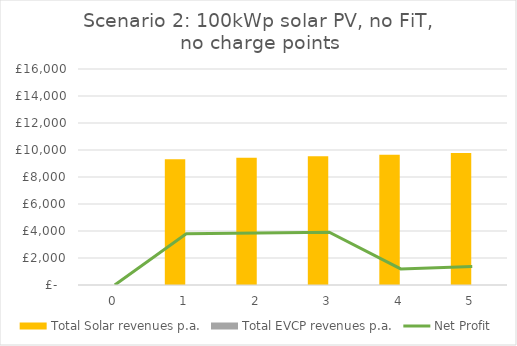
| Category | Total Solar revenues p.a. | Total EVCP revenues p.a. |
|---|---|---|
| 0.0 | 0 | 0 |
| 1.0 | 9310 | 0 |
| 2.0 | 9423.81 | 0 |
| 3.0 | 9539.534 | 0 |
| 4.0 | 9657.197 | 0 |
| 5.0 | 9776.827 | 0 |